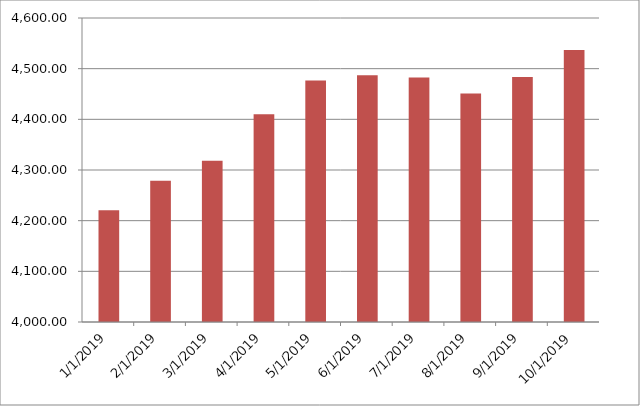
| Category | Series 0 | Series 1 |
|---|---|---|
| 1/1/19 |  | 4220.44 |
| 2/1/19 |  | 4278.86 |
| 3/1/19 |  | 4318.42 |
| 4/1/19 |  | 4410.04 |
| 5/1/19 |  | 4476.6 |
| 6/1/19 |  | 4486.97 |
| 7/1/19 |  | 4482.57 |
| 8/1/19 |  | 4450.86 |
| 9/1/19 |  | 4483.52 |
| 10/1/19 |  | 4536.6 |